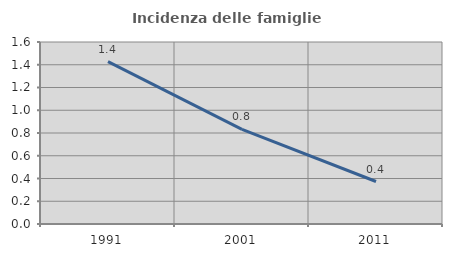
| Category | Incidenza delle famiglie numerose |
|---|---|
| 1991.0 | 1.427 |
| 2001.0 | 0.832 |
| 2011.0 | 0.374 |